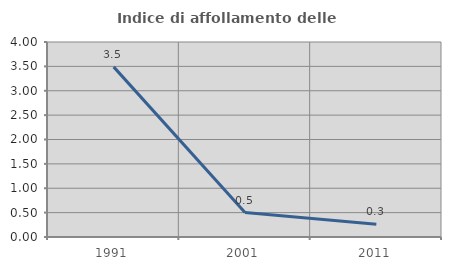
| Category | Indice di affollamento delle abitazioni  |
|---|---|
| 1991.0 | 3.49 |
| 2001.0 | 0.503 |
| 2011.0 | 0.264 |